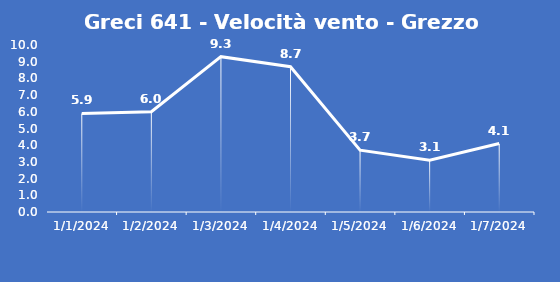
| Category | Greci 641 - Velocità vento - Grezzo (m/s) |
|---|---|
| 1/1/24 | 5.9 |
| 1/2/24 | 6 |
| 1/3/24 | 9.3 |
| 1/4/24 | 8.7 |
| 1/5/24 | 3.7 |
| 1/6/24 | 3.1 |
| 1/7/24 | 4.1 |